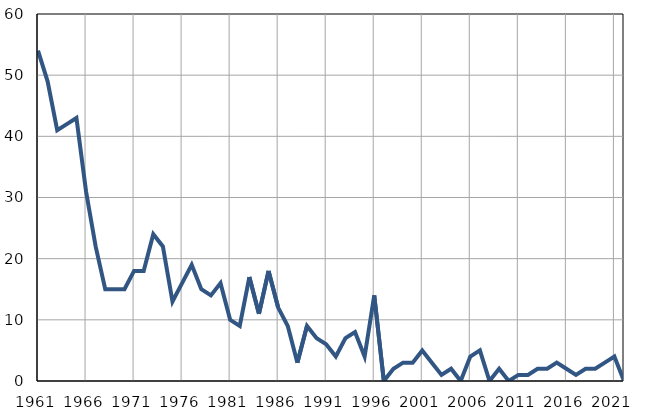
| Category | Infants
deaths |
|---|---|
| 1961.0 | 54 |
| 1962.0 | 49 |
| 1963.0 | 41 |
| 1964.0 | 42 |
| 1965.0 | 43 |
| 1966.0 | 31 |
| 1967.0 | 22 |
| 1968.0 | 15 |
| 1969.0 | 15 |
| 1970.0 | 15 |
| 1971.0 | 18 |
| 1972.0 | 18 |
| 1973.0 | 24 |
| 1974.0 | 22 |
| 1975.0 | 13 |
| 1976.0 | 16 |
| 1977.0 | 19 |
| 1978.0 | 15 |
| 1979.0 | 14 |
| 1980.0 | 16 |
| 1981.0 | 10 |
| 1982.0 | 9 |
| 1983.0 | 17 |
| 1984.0 | 11 |
| 1985.0 | 18 |
| 1986.0 | 12 |
| 1987.0 | 9 |
| 1988.0 | 3 |
| 1989.0 | 9 |
| 1990.0 | 7 |
| 1991.0 | 6 |
| 1992.0 | 4 |
| 1993.0 | 7 |
| 1994.0 | 8 |
| 1995.0 | 4 |
| 1996.0 | 14 |
| 1997.0 | 0 |
| 1998.0 | 2 |
| 1999.0 | 3 |
| 2000.0 | 3 |
| 2001.0 | 5 |
| 2002.0 | 3 |
| 2003.0 | 1 |
| 2004.0 | 2 |
| 2005.0 | 0 |
| 2006.0 | 4 |
| 2007.0 | 5 |
| 2008.0 | 0 |
| 2009.0 | 2 |
| 2010.0 | 0 |
| 2011.0 | 1 |
| 2012.0 | 1 |
| 2013.0 | 2 |
| 2014.0 | 2 |
| 2015.0 | 3 |
| 2016.0 | 2 |
| 2017.0 | 1 |
| 2018.0 | 2 |
| 2019.0 | 2 |
| 2020.0 | 3 |
| 2021.0 | 4 |
| 2022.0 | 0 |